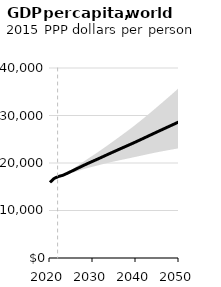
| Category | Series 1 |
|---|---|
| 2020.0 | 15930.251 |
| 2021.0 | 16771.046 |
| 2022.0 | 17167.286 |
| 2023.0 | 17415.693 |
| 2024.0 | 17826.719 |
| 2025.0 | 18262.146 |
| 2026.0 | 18699.433 |
| 2027.0 | 19135.967 |
| 2028.0 | 19573.383 |
| 2029.0 | 19991.964 |
| 2030.0 | 20391.648 |
| 2031.0 | 20792.961 |
| 2032.0 | 21205.106 |
| 2033.0 | 21623.211 |
| 2034.0 | 22037.694 |
| 2035.0 | 22444.668 |
| 2036.0 | 22849.102 |
| 2037.0 | 23251.036 |
| 2038.0 | 23651.3 |
| 2039.0 | 24051.624 |
| 2040.0 | 24465.831 |
| 2041.0 | 24885.248 |
| 2042.0 | 25308.361 |
| 2043.0 | 25734.937 |
| 2044.0 | 26161.644 |
| 2045.0 | 26584.052 |
| 2046.0 | 27001.237 |
| 2047.0 | 27417.834 |
| 2048.0 | 27833.645 |
| 2049.0 | 28248.514 |
| 2050.0 | 28673.099 |